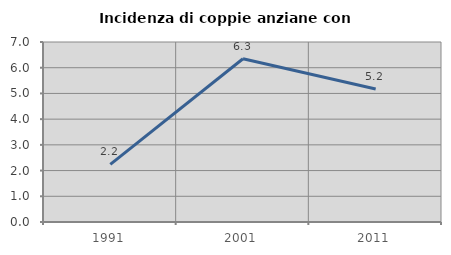
| Category | Incidenza di coppie anziane con figli |
|---|---|
| 1991.0 | 2.239 |
| 2001.0 | 6.349 |
| 2011.0 | 5.172 |